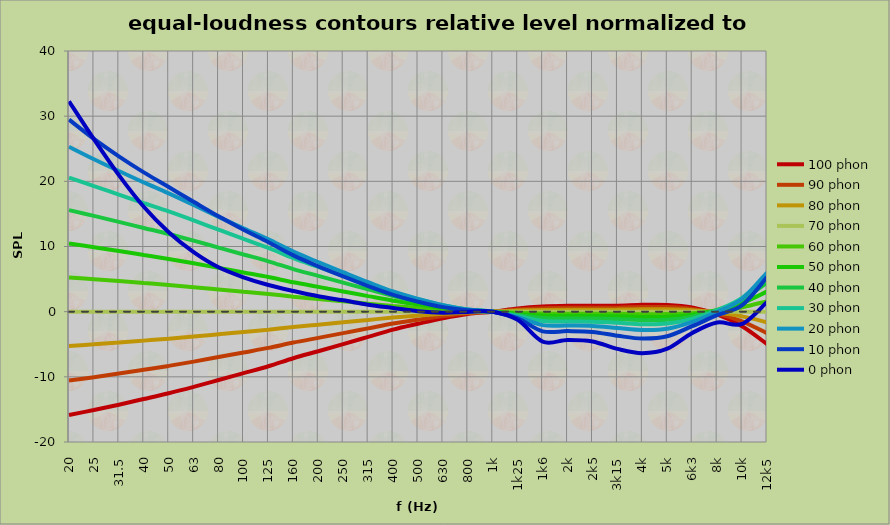
| Category | 100 phon | 90 phon | 80 phon | 70 phon | 60 phon | 50 phon | 40 phon | 30 phon | 20 phon | 10 phon | 0 phon |
|---|---|---|---|---|---|---|---|---|---|---|---|
| 20 | -15.847 | -10.556 | -5.271 | 0 | 5.248 | 10.455 | 15.587 | 20.578 | 25.3 | 29.466 | 32.288 |
| 25 | -15.094 | -10.049 | -5.015 | 0 | 4.979 | 9.895 | 14.692 | 19.266 | 23.391 | 26.503 | 26.467 |
| 31,5 | -14.273 | -9.498 | -4.737 | 0 | 4.694 | 9.309 | 13.778 | 17.968 | 21.584 | 23.83 | 20.96 |
| 40 | -13.401 | -8.915 | -4.444 | 0 | 4.395 | 8.702 | 12.844 | 16.667 | 19.83 | 21.37 | 16.096 |
| 50 | -12.515 | -8.323 | -4.147 | 0 | 4.094 | 8.093 | 11.913 | 15.389 | 18.145 | 19.117 | 12.192 |
| 63 | -11.532 | -7.667 | -3.818 | 0 | 3.763 | 7.425 | 10.9 | 14.013 | 16.37 | 16.857 | 9.135 |
| 80 | -10.486 | -6.968 | -3.468 | 0 | 3.411 | 6.719 | 9.834 | 12.577 | 14.549 | 14.627 | 6.804 |
| 100 | -9.429 | -6.263 | -3.116 | 0 | 3.058 | 6.013 | 8.774 | 11.163 | 12.787 | 12.571 | 5.275 |
| 125 | -8.376 | -5.562 | -2.765 | 0 | 2.709 | 5.314 | 7.73 | 9.781 | 11.091 | 10.656 | 4.091 |
| 160 | -7.145 | -4.742 | -2.356 | 0 | 2.302 | 4.506 | 6.529 | 8.21 | 9.203 | 8.634 | 3.175 |
| 200 | -6.07 | -4.027 | -1.999 | 0 | 1.948 | 3.805 | 5.493 | 6.863 | 7.603 | 6.957 | 2.357 |
| 250 | -4.974 | -3.298 | -1.636 | 0 | 1.59 | 3.098 | 4.455 | 5.53 | 6.055 | 5.412 | 1.742 |
| 315 | -3.864 | -2.56 | -1.269 | 0 | 1.229 | 2.387 | 3.416 | 4.204 | 4.532 | 3.916 | 1.062 |
| 400 | -2.751 | -1.822 | -0.902 | 0 | 0.871 | 1.685 | 2.397 | 2.923 | 3.097 | 2.58 | 0.559 |
| 500 | -1.853 | -1.225 | -0.606 | 0 | 0.582 | 1.121 | 1.583 | 1.904 | 1.965 | 1.528 | 0.076 |
| 630 | -1.007 | -0.665 | -0.328 | 0 | 0.313 | 0.6 | 0.839 | 0.992 | 0.988 | 0.695 | -0.154 |
| 800 | -0.343 | -0.226 | -0.112 | 0 | 0.106 | 0.203 | 0.283 | 0.332 | 0.327 | 0.225 | -0.054 |
| 1k | 0 | 0 | 0 | 0 | 0 | 0 | 0 | 0 | 0 | 0 | 0 |
| 1k25 | 0.49 | 0.327 | 0.164 | 0 | -0.164 | -0.33 | -0.498 | -0.67 | -0.85 | -1.043 | -1.26 |
| 1k6 | 0.778 | 0.525 | 0.267 | 0 | -0.284 | -0.597 | -0.963 | -1.425 | -2.061 | -3.02 | -4.602 |
| 2k | 0.897 | 0.603 | 0.305 | 0 | -0.319 | -0.662 | -1.049 | -1.513 | -2.119 | -2.984 | -4.34 |
| 2k5 | 0.9 | 0.606 | 0.307 | 0 | -0.322 | -0.67 | -1.066 | -1.547 | -2.182 | -3.103 | -4.569 |
| 3k15 | 0.914 | 0.618 | 0.315 | 0 | -0.336 | -0.709 | -1.148 | -1.709 | -2.492 | -3.692 | -5.717 |
| 4k | 1.046 | 0.706 | 0.36 | 0 | -0.382 | -0.805 | -1.301 | -1.928 | -2.799 | -4.128 | -6.373 |
| 5k | 1.038 | 0.699 | 0.355 | 0 | -0.374 | -0.783 | -1.252 | -1.833 | -2.616 | -3.778 | -5.68 |
| 6k3 | 0.638 | 0.43 | 0.218 | 0 | -0.229 | -0.477 | -0.76 | -1.105 | -1.561 | -2.222 | -3.263 |
| 8k | -0.434 | -0.283 | -0.137 | 0 | 0.121 | 0.214 | 0.256 | 0.206 | -0.012 | -0.539 | -1.664 |
| 10k | -2.237 | -1.477 | -0.728 | 0 | 0.691 | 1.316 | 1.821 | 2.106 | 1.971 | 0.995 | -1.885 |
| 12k5 | -4.972 | -3.296 | -1.635 | 0 | 1.589 | 3.093 | 4.444 | 5.507 | 6.009 | 5.315 | 1.488 |